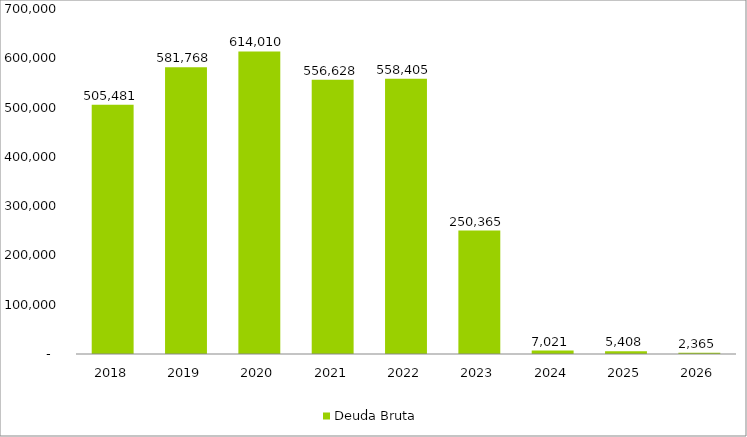
| Category | Deuda Bruta |
|---|---|
| 2018 | 505481.117 |
| 2019 | 581767.909 |
| 2020 | 614009.69 |
| 2021 | 556628.474 |
| 2022 | 558405.292 |
| 2023 | 250365.315 |
| 2024 | 7021.369 |
| 2025 | 5407.91 |
| 2026 | 2364.721 |